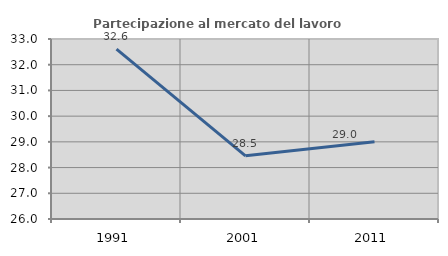
| Category | Partecipazione al mercato del lavoro  femminile |
|---|---|
| 1991.0 | 32.609 |
| 2001.0 | 28.455 |
| 2011.0 | 29 |